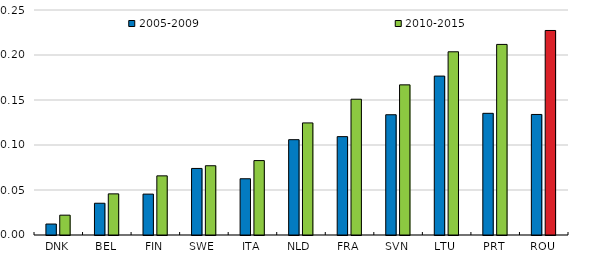
| Category | 2005-2009 | 2010-2015 |
|---|---|---|
| DNK | 0.012 | 0.022 |
| BEL | 0.035 | 0.046 |
| FIN | 0.045 | 0.066 |
| SWE | 0.074 | 0.077 |
| ITA | 0.062 | 0.083 |
| NLD | 0.106 | 0.125 |
| FRA | 0.109 | 0.151 |
| SVN | 0.134 | 0.167 |
| LTU | 0.177 | 0.204 |
| PRT | 0.135 | 0.212 |
| ROU | 0.134 | 0.227 |